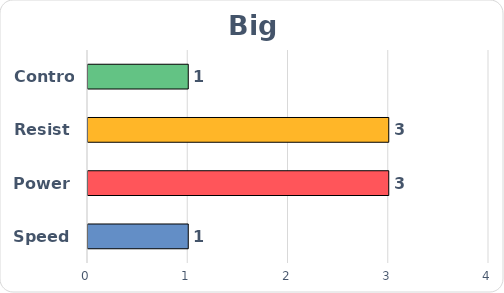
| Category | Series 0 |
|---|---|
| Speed | 1 |
| Power | 3 |
| Resist | 3 |
| Control | 1 |